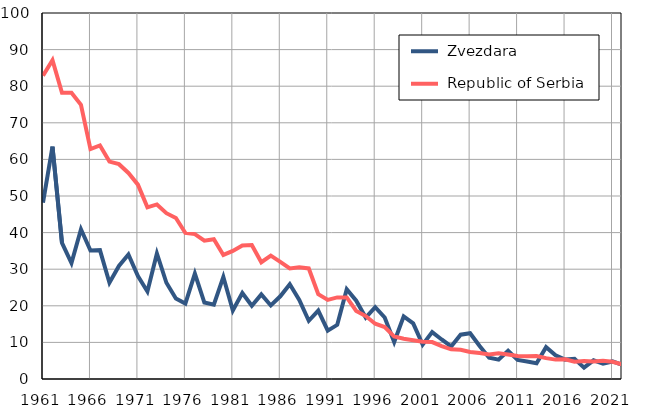
| Category |  Zvezdara |  Republic of Serbia |
|---|---|---|
| 1961.0 | 48.2 | 82.9 |
| 1962.0 | 63.5 | 87.1 |
| 1963.0 | 37.2 | 78.2 |
| 1964.0 | 31.7 | 78.2 |
| 1965.0 | 40.9 | 74.9 |
| 1966.0 | 35.1 | 62.8 |
| 1967.0 | 35.2 | 63.8 |
| 1968.0 | 26.3 | 59.4 |
| 1969.0 | 30.9 | 58.7 |
| 1970.0 | 34 | 56.3 |
| 1971.0 | 28.1 | 53.1 |
| 1972.0 | 23.9 | 46.9 |
| 1973.0 | 34.3 | 47.7 |
| 1974.0 | 26.3 | 45.3 |
| 1975.0 | 22 | 44 |
| 1976.0 | 20.6 | 39.9 |
| 1977.0 | 28.8 | 39.6 |
| 1978.0 | 20.9 | 37.8 |
| 1979.0 | 20.3 | 38.2 |
| 1980.0 | 27.9 | 33.9 |
| 1981.0 | 18.7 | 35 |
| 1982.0 | 23.5 | 36.5 |
| 1983.0 | 20 | 36.6 |
| 1984.0 | 23.1 | 31.9 |
| 1985.0 | 20.1 | 33.7 |
| 1986.0 | 22.6 | 32 |
| 1987.0 | 25.9 | 30.2 |
| 1988.0 | 21.6 | 30.5 |
| 1989.0 | 15.9 | 30.2 |
| 1990.0 | 18.7 | 23.2 |
| 1991.0 | 13.2 | 21.6 |
| 1992.0 | 14.8 | 22.3 |
| 1993.0 | 24.5 | 22.3 |
| 1994.0 | 21.4 | 18.6 |
| 1995.0 | 16.8 | 17.2 |
| 1996.0 | 19.6 | 15.1 |
| 1997.0 | 16.8 | 14.2 |
| 1998.0 | 10.1 | 11.6 |
| 1999.0 | 17.1 | 11 |
| 2000.0 | 15.2 | 10.6 |
| 2001.0 | 9.4 | 10.2 |
| 2002.0 | 12.8 | 10.1 |
| 2003.0 | 10.8 | 9 |
| 2004.0 | 8.9 | 8.1 |
| 2005.0 | 12.1 | 8 |
| 2006.0 | 12.5 | 7.4 |
| 2007.0 | 9 | 7.1 |
| 2008.0 | 5.8 | 6.7 |
| 2009.0 | 5.3 | 7 |
| 2010.0 | 7.7 | 6.7 |
| 2011.0 | 5.2 | 6.3 |
| 2012.0 | 4.8 | 6.2 |
| 2013.0 | 4.3 | 6.3 |
| 2014.0 | 8.7 | 5.7 |
| 2015.0 | 6.5 | 5.3 |
| 2016.0 | 5.3 | 5.4 |
| 2017.0 | 5.5 | 4.7 |
| 2018.0 | 3.1 | 4.9 |
| 2019.0 | 5.1 | 4.8 |
| 2020.0 | 4.2 | 5 |
| 2021.0 | 4.8 | 4.7 |
| 2022.0 | 3.9 | 4 |